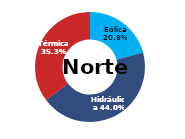
| Category | Norte |
|---|---|
| Eólica | 65.406 |
| Hidráulica | 138.553 |
| Solar | 0 |
| Térmica | 111.103 |